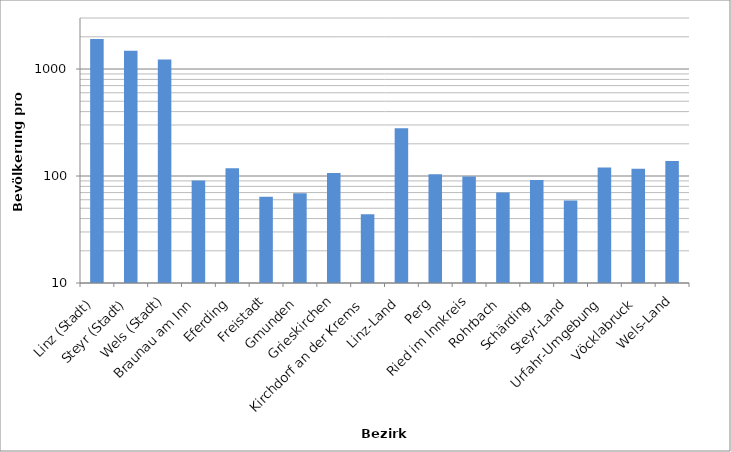
| Category | Series 0 |
|---|---|
| Linz (Stadt) | 1912 |
| Steyr (Stadt) | 1481 |
| Wels (Stadt) | 1230 |
| Braunau am Inn | 91 |
| Eferding | 118 |
| Freistadt | 64 |
| Gmunden | 69 |
| Grieskirchen | 107 |
| Kirchdorf an der Krems | 44 |
| Linz-Land | 280 |
| Perg | 104 |
| Ried im Innkreis | 99 |
| Rohrbach | 70 |
| Schärding | 92 |
| Steyr-Land | 59 |
| Urfahr-Umgebung | 120 |
| Vöcklabruck | 117 |
| Wels-Land | 138 |